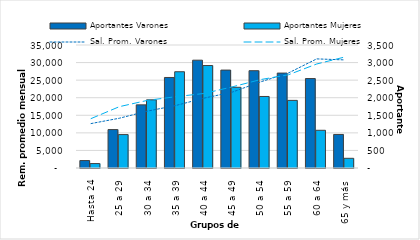
| Category | Aportantes Varones | Aportantes Mujeres |
|---|---|---|
| Hasta 24 | 212 | 126 |
| 25 a 29 | 1093 | 951 |
| 30 a 34 | 1797 | 1940 |
| 35 a 39 | 2576 | 2739 |
| 40 a 44 | 3068 | 2916 |
| 45 a 49 | 2786 | 2296 |
| 50 a 54 | 2769 | 2035 |
| 55 a 59 | 2701 | 1924 |
| 60 a 64 | 2545 | 1073 |
| 65 y más | 955 | 276 |